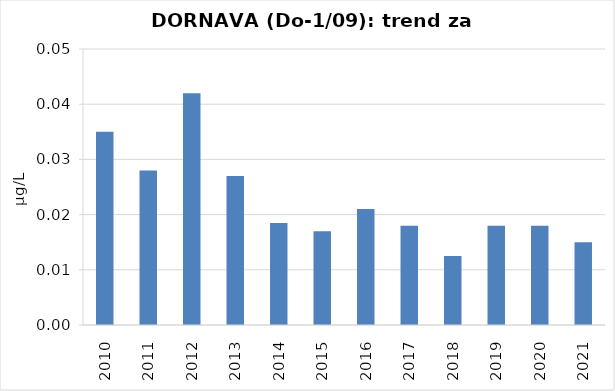
| Category | Vsota |
|---|---|
| 2010 | 0.035 |
| 2011 | 0.028 |
| 2012 | 0.042 |
| 2013 | 0.027 |
| 2014 | 0.018 |
| 2015 | 0.017 |
| 2016 | 0.021 |
| 2017 | 0.018 |
| 2018 | 0.012 |
| 2019 | 0.018 |
| 2020 | 0.018 |
| 2021 | 0.015 |